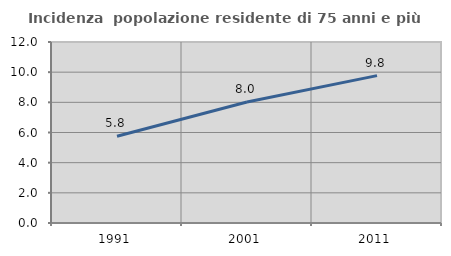
| Category | Incidenza  popolazione residente di 75 anni e più |
|---|---|
| 1991.0 | 5.756 |
| 2001.0 | 8.021 |
| 2011.0 | 9.771 |